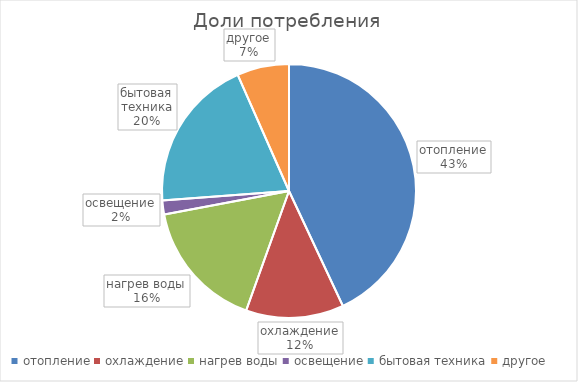
| Category | Series 0 |
|---|---|
| отопление | 2941805.211 |
| охлаждение | 851760 |
| нагрев воды | 1131463.543 |
| освещение | 121680 |
| бытовая техника | 1338480 |
| другое | 452585.417 |